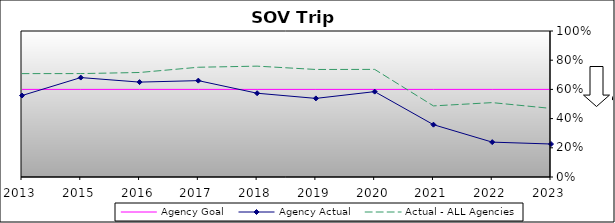
| Category | Agency Goal | Agency Actual | Actual - ALL Agencies |
|---|---|---|---|
| 2013.0 | 0.6 | 0.558 | 0.708 |
| 2015.0 | 0.6 | 0.681 | 0.708 |
| 2016.0 | 0.6 | 0.65 | 0.716 |
| 2017.0 | 0.6 | 0.66 | 0.752 |
| 2018.0 | 0.6 | 0.574 | 0.759 |
| 2019.0 | 0.6 | 0.538 | 0.736 |
| 2020.0 | 0.6 | 0.585 | 0.737 |
| 2021.0 | 0.6 | 0.358 | 0.487 |
| 2022.0 | 0.6 | 0.239 | 0.509 |
| 2023.0 | 0.6 | 0.226 | 0.47 |